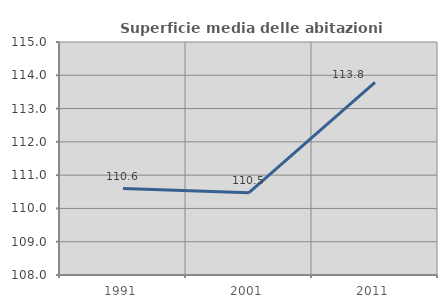
| Category | Superficie media delle abitazioni occupate |
|---|---|
| 1991.0 | 110.599 |
| 2001.0 | 110.471 |
| 2011.0 | 113.786 |